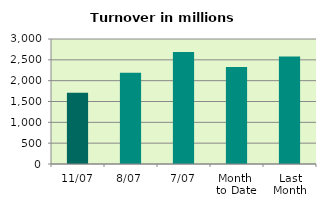
| Category | Series 0 |
|---|---|
| 11/07 | 1711.121 |
| 8/07 | 2188.977 |
| 7/07 | 2685.233 |
| Month 
to Date | 2328.137 |
| Last
Month | 2579.746 |